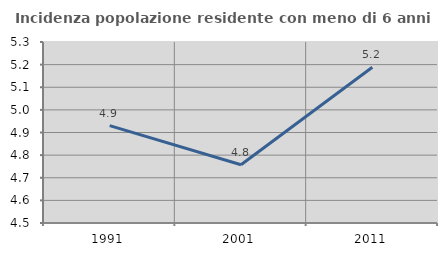
| Category | Incidenza popolazione residente con meno di 6 anni |
|---|---|
| 1991.0 | 4.93 |
| 2001.0 | 4.758 |
| 2011.0 | 5.189 |